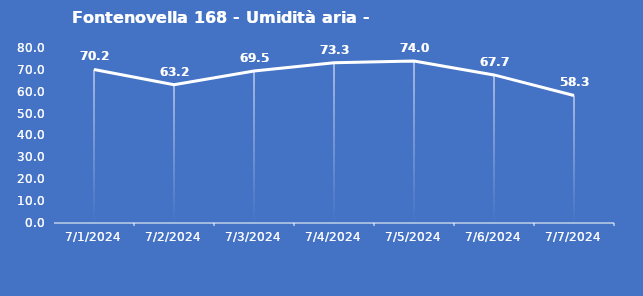
| Category | Fontenovella 168 - Umidità aria - Grezzo (%) |
|---|---|
| 7/1/24 | 70.2 |
| 7/2/24 | 63.2 |
| 7/3/24 | 69.5 |
| 7/4/24 | 73.3 |
| 7/5/24 | 74 |
| 7/6/24 | 67.7 |
| 7/7/24 | 58.3 |